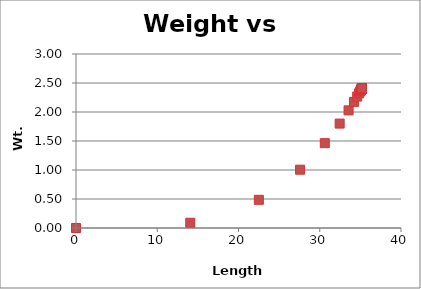
| Category | Series 1 |
|---|---|
| 0.0 | 0 |
| 14.062555625808242 | 0.09 |
| 22.507058105907642 | 0.486 |
| 27.577944510476556 | 1.005 |
| 30.62298937707941 | 1.463 |
| 32.45152535675941 | 1.8 |
| 33.549553128256406 | 2.028 |
| 34.20891395045344 | 2.174 |
| 34.60485720902478 | 2.266 |
| 34.842619385257386 | 2.322 |
| 34.985394520893855 | 2.356 |
| 35.07113035860787 | 2.377 |
| 35.1226143501009 | 2.389 |
| 35.15353025937208 | 2.397 |
| 35.17209512620438 | 2.402 |
| 35.18324324665842 | 2.404 |
| 35.18993764370313 | 2.406 |
| 35.193957599531295 | 2.407 |
| 35.196371565233136 | 2.407 |
| 35.197821140964486 | 2.408 |
| 35.198691604782326 | 2.408 |
| 35.19921431445645 | 2.408 |